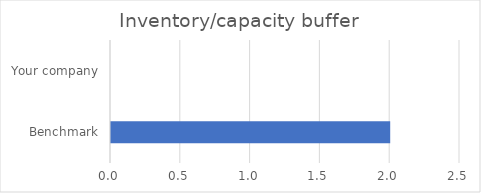
| Category | Inventory/capacity buffer |
|---|---|
| Benchmark | 2 |
| Your company | 0 |